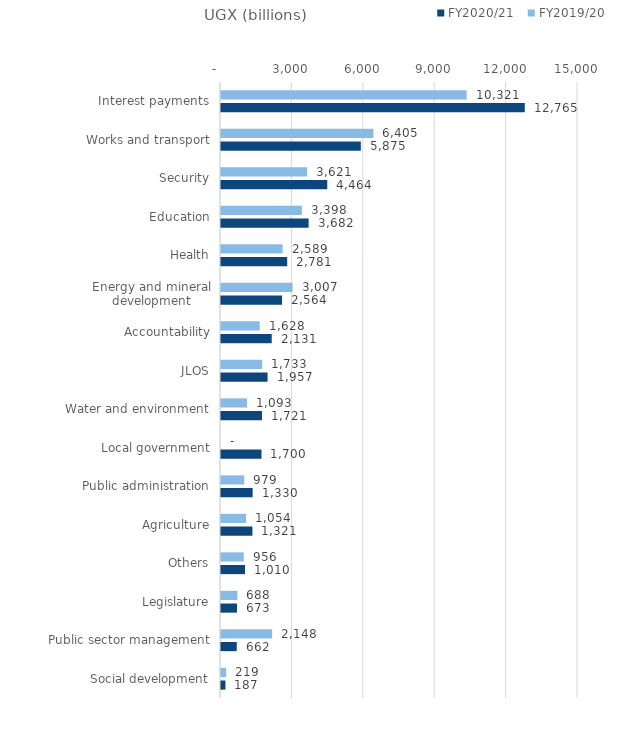
| Category | FY2020/21 | FY2019/20 |
|---|---|---|
| Social development | 187.202 | 219.161 |
| Public sector management | 662.21 | 2148.077 |
| Legislature | 672.829 | 687.779 |
| Others | 1009.527 | 955.735 |
| Agriculture | 1321.045 | 1053.553 |
| Public administration | 1330.262 | 978.622 |
| Local government | 1700.45 | 0 |
| Water and environment | 1721.444 | 1092.803 |
| JLOS | 1956.523 | 1733.01 |
| Accountability | 2131.429 | 1627.781 |
| Energy and mineral development | 2564.258 | 3007.184 |
| Health | 2781.175 | 2589.486 |
| Education | 3682.114 | 3397.642 |
| Security | 4464.328 | 3620.78 |
| Works and transport | 5874.807 | 6404.566 |
| Interest payments | 12764.633 | 10321.08 |